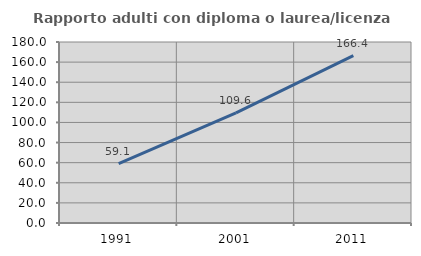
| Category | Rapporto adulti con diploma o laurea/licenza media  |
|---|---|
| 1991.0 | 59.108 |
| 2001.0 | 109.589 |
| 2011.0 | 166.4 |